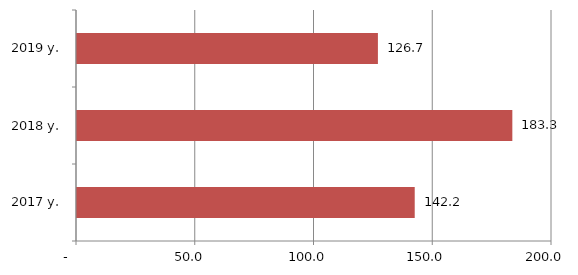
| Category | Series 0 |
|---|---|
| 2017 y. | 142.2 |
| 2018 y. | 183.3 |
| 2019 y. | 126.7 |